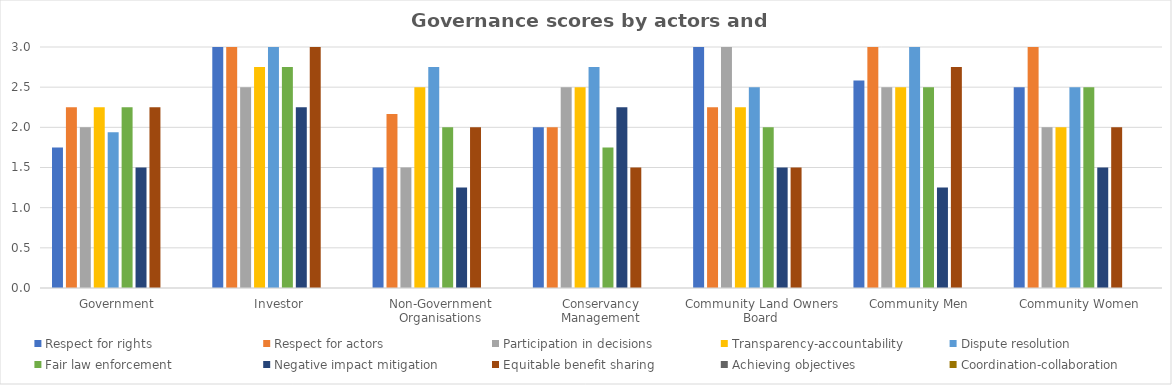
| Category | Respect for rights | Respect for actors | Participation in decisions | Transparency-accountability | Dispute resolution | Fair law enforcement | Negative impact mitigation | Equitable benefit sharing | Achieving objectives | Coordination-collaboration |
|---|---|---|---|---|---|---|---|---|---|---|
| Government  | 1.75 | 2.25 | 2 | 2.25 | 1.938 | 2.25 | 1.5 | 2.25 | 0 | 0 |
| Investor | 3 | 3 | 2.5 | 2.75 | 3 | 2.75 | 2.25 | 3 | 0 | 0 |
| Non-Government Organisations | 1.5 | 2.167 | 1.5 | 2.5 | 2.75 | 2 | 1.25 | 2 | 0 | 0 |
| Conservancy Management | 2 | 2 | 2.5 | 2.5 | 2.75 | 1.75 | 2.25 | 1.5 | 0 | 0 |
| Community Land Owners Board | 3 | 2.25 | 3 | 2.25 | 2.5 | 2 | 1.5 | 1.5 | 0 | 0 |
| Community Men  | 2.583 | 3 | 2.5 | 2.5 | 3 | 2.5 | 1.25 | 2.75 | 0 | 0 |
| Community Women  | 2.5 | 3 | 2 | 2 | 2.5 | 2.5 | 1.5 | 2 | 0 | 0 |